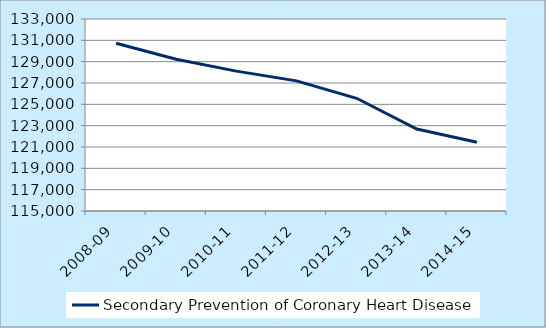
| Category | Secondary Prevention of Coronary Heart Disease  |
|---|---|
| 2008-09 | 130725 |
| 2009-10 | 129223 |
| 2010-11 | 128114 |
| 2011-12 | 127200 |
| 2012-13 | 125567 |
| 2013-14 | 122688 |
| 2014-15 | 121442 |